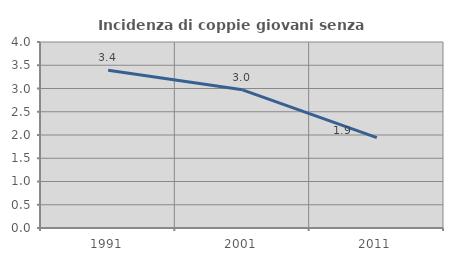
| Category | Incidenza di coppie giovani senza figli |
|---|---|
| 1991.0 | 3.393 |
| 2001.0 | 2.972 |
| 2011.0 | 1.942 |